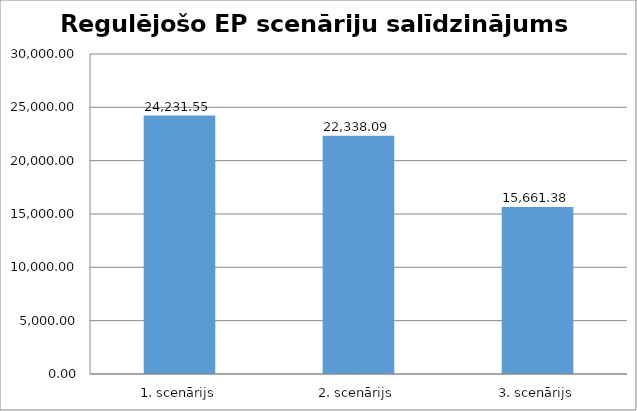
| Category | 1. scenārijs |
|---|---|
| 1. scenārijs | 24231.553 |
| 2. scenārijs | 22338.086 |
| 3. scenārijs | 15661.38 |